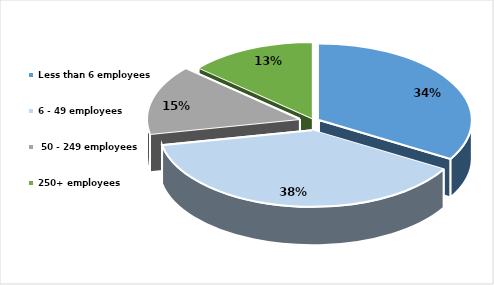
| Category | Series 0 |
|---|---|
| Less than 6 employees | 0.335 |
| 6 - 49 employees | 0.384 |
|  50 - 249 employees | 0.147 |
| 250+ employees | 0.134 |